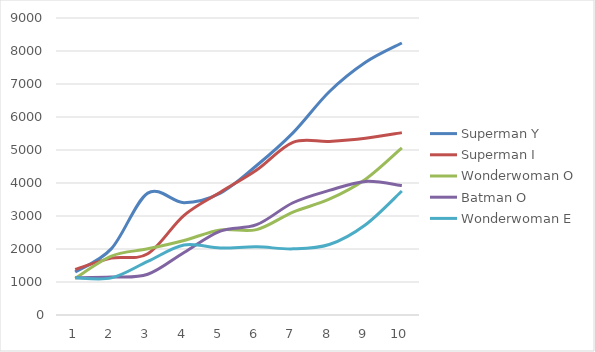
| Category | Superman | Wonderwoman | Batman |
|---|---|---|---|
| 1.0 | 1382 | 1131 | 1129 |
| 2.0 | 1724 | 1125 | 1150 |
| 3.0 | 1856 | 1623 | 1235 |
| 4.0 | 3020 | 2120 | 1895 |
| 5.0 | 3722 | 2033 | 2543 |
| 6.0 | 4392 | 2065 | 2736 |
| 7.0 | 5230 | 2004 | 3401 |
| 8.0 | 5259 | 2136 | 3775 |
| 9.0 | 5353 | 2737 | 4048 |
| 10.0 | 5526 | 3758 | 3922 |